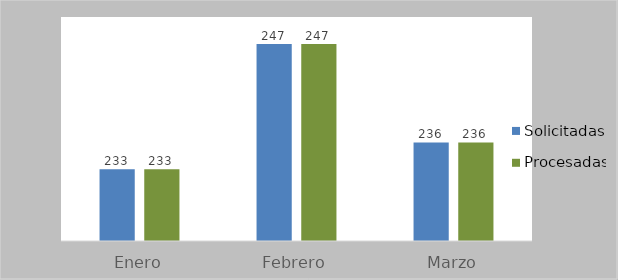
| Category | Solicitadas | Procesadas |
|---|---|---|
| Enero | 233 | 233 |
| Febrero | 247 | 247 |
| Marzo | 236 | 236 |